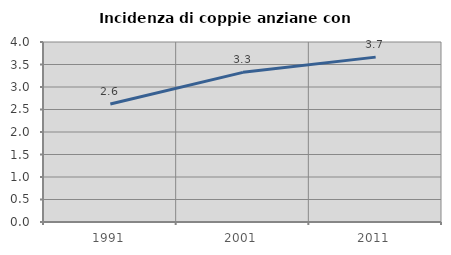
| Category | Incidenza di coppie anziane con figli |
|---|---|
| 1991.0 | 2.623 |
| 2001.0 | 3.326 |
| 2011.0 | 3.664 |